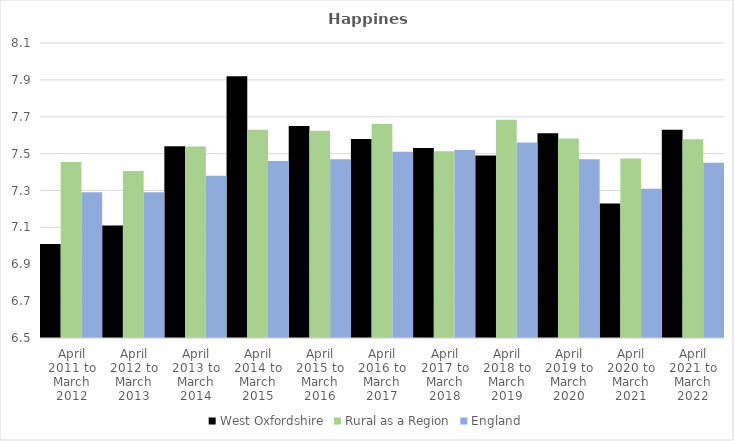
| Category | West Oxfordshire | Rural as a Region | England |
|---|---|---|---|
| April 2011 to March 2012 | 7.01 | 7.454 | 7.29 |
| April 2012 to March 2013 | 7.11 | 7.406 | 7.29 |
| April 2013 to March 2014 | 7.54 | 7.539 | 7.38 |
| April 2014 to March 2015 | 7.92 | 7.63 | 7.46 |
| April 2015 to March 2016 | 7.65 | 7.625 | 7.47 |
| April 2016 to March 2017 | 7.58 | 7.661 | 7.51 |
| April 2017 to March 2018 | 7.53 | 7.513 | 7.52 |
| April 2018 to March 2019 | 7.49 | 7.684 | 7.56 |
| April 2019 to March 2020 | 7.61 | 7.582 | 7.47 |
| April 2020 to March 2021 | 7.23 | 7.474 | 7.31 |
| April 2021 to March 2022 | 7.63 | 7.577 | 7.45 |